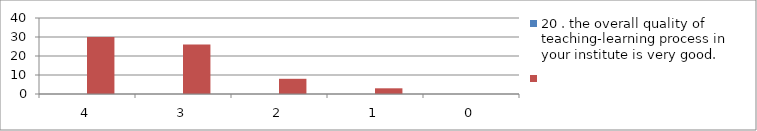
| Category | 20 . the overall quality of teaching-learning process in
your institute is very good. | Series 1 |
|---|---|---|
| 4.0 | 0 | 30 |
| 3.0 | 0 | 26 |
| 2.0 | 0 | 8 |
| 1.0 | 0 | 3 |
| 0.0 | 0 | 0 |